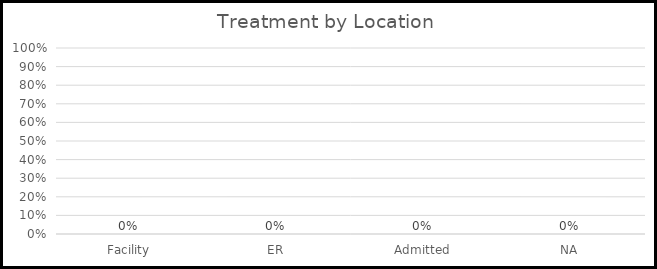
| Category | Treatment by Location |
|---|---|
| Facility | 0 |
| ER | 0 |
| Admitted | 0 |
| NA | 0 |